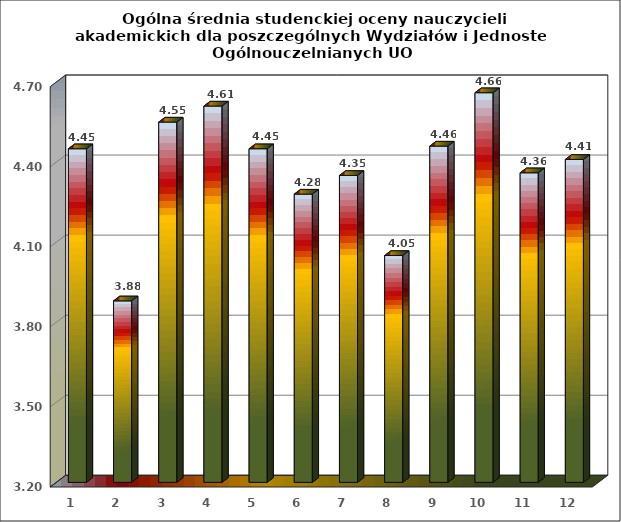
| Category | Series 0 |
|---|---|
| 0 | 4.45 |
| 1 | 3.88 |
| 2 | 4.55 |
| 3 | 4.61 |
| 4 | 4.45 |
| 5 | 4.28 |
| 6 | 4.35 |
| 7 | 4.05 |
| 8 | 4.46 |
| 9 | 4.66 |
| 10 | 4.36 |
| 11 | 4.41 |